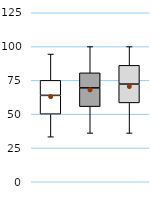
| Category | 25th | 50th | 75th |
|---|---|---|---|
| UK | 50 | 13.889 | 11.111 |
| Top 50% | 55.556 | 13.889 | 11.111 |
| Top 10% | 58.333 | 13.889 | 13.889 |